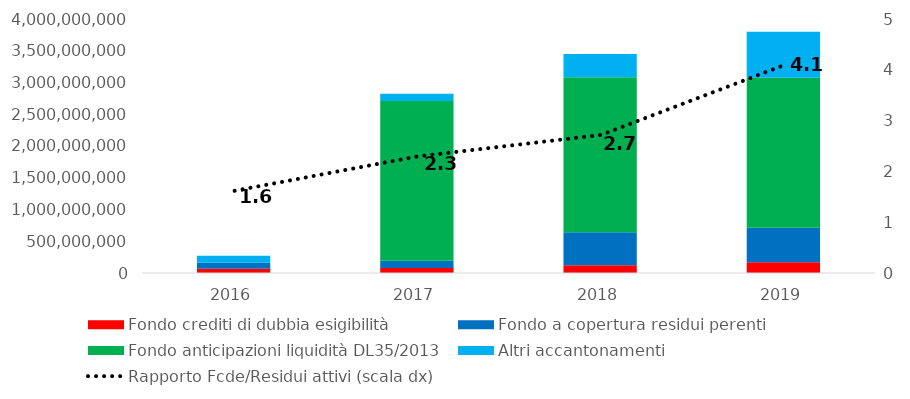
| Category | Fondo crediti di dubbia esigibilità | Fondo a copertura residui perenti | Fondo anticipazioni liquidità DL35/2013 | Altri accantonamenti |
|---|---|---|---|---|
| 2016.0 | 67901259.46 | 95280000 | 0 | 107841800.36 |
| 2017.0 | 79742106 | 114336000 | 2515569000 | 112700118.81 |
| 2018.0 | 121897644.42 | 520966376.29 | 2438598061.2 | 365644150.05 |
| 2019.0 | 167996686.4 | 544625815.43 | 2360763351.58 | 724576353.1 |